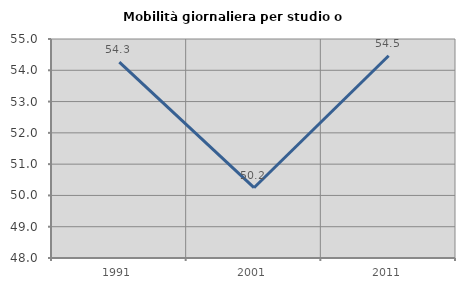
| Category | Mobilità giornaliera per studio o lavoro |
|---|---|
| 1991.0 | 54.263 |
| 2001.0 | 50.247 |
| 2011.0 | 54.464 |